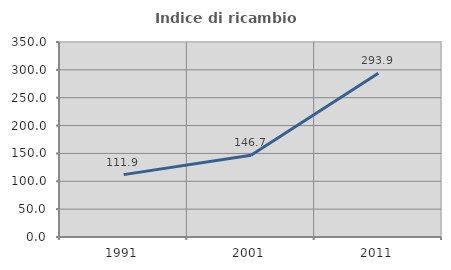
| Category | Indice di ricambio occupazionale  |
|---|---|
| 1991.0 | 111.927 |
| 2001.0 | 146.729 |
| 2011.0 | 293.902 |